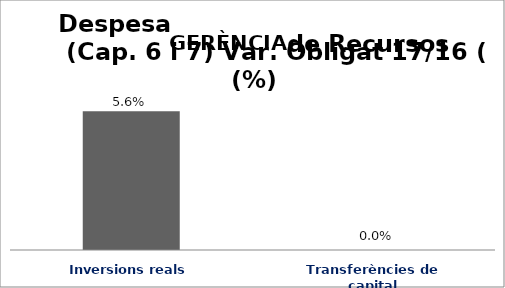
| Category | Series 0 |
|---|---|
| Inversions reals | 0.056 |
| Transferències de capital | 0 |